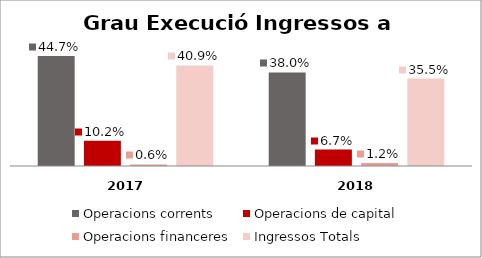
| Category | Operacions corrents | Operacions de capital | Operacions financeres | Ingressos Totals |
|---|---|---|---|---|
| 0 | 0.447 | 0.102 | 0.006 | 0.409 |
| 1 | 0.38 | 0.067 | 0.012 | 0.355 |